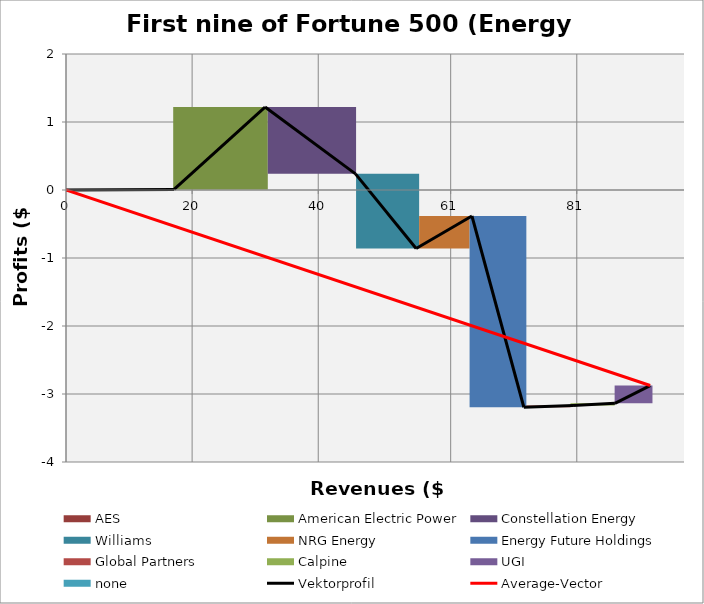
| Category | transparent | AES | American Electric Power | Constellation Energy | Williams | NRG Energy | Energy Future Holdings | Global Partners | Calpine | UGI | none | Border right & top |
|---|---|---|---|---|---|---|---|---|---|---|---|---|
| 0.0 | 0 | 0.009 | 0 | 0 | 0 | 0 | 0 | 0 | 0 | 0 | 0 | 0 |
| 17.138 | 0 | 0.009 | 0 | 0 | 0 | 0 | 0 | 0 | 0 | 0 | 0 | 0 |
| 17.138 | 0.009 | 0 | 1.211 | 0 | 0 | 0 | 0 | 0 | 0 | 0 | 0 | 0 |
| 31.565 | 0.009 | 0 | 1.211 | 0 | 0 | 0 | 0 | 0 | 0 | 0 | 0 | 0 |
| 31.565 | 1.22 | 0 | 0 | -0.983 | 0 | 0 | 0 | 0 | 0 | 0 | 0 | 0 |
| 45.905 | 1.22 | 0 | 0 | -0.983 | 0 | 0 | 0 | 0 | 0 | 0 | 0 | 0 |
| 45.905 | 0.237 | 0 | 0 | 0 | -1.097 | 0 | 0 | 0 | 0 | 0 | 0 | 0 |
| 55.521 | 0.237 | 0 | 0 | 0 | -1.097 | 0 | 0 | 0 | 0 | 0 | 0 | 0 |
| 55.521 | -0.86 | 0 | 0 | 0 | 0 | 0.477 | 0 | 0 | 0 | 0 | 0 | 0 |
| 64.37 | -0.86 | 0 | 0 | 0 | 0 | 0.477 | 0 | 0 | 0 | 0 | 0 | 0 |
| 64.37 | -0.383 | 0 | 0 | 0 | 0 | 0 | -2.812 | 0 | 0 | 0 | 0 | 0 |
| 72.605 | -0.383 | 0 | 0 | 0 | 0 | 0 | -2.812 | 0 | 0 | 0 | 0 | 0 |
| 72.605 | -3.195 | 0 | 0 | 0 | 0 | 0 | 0 | 0.027 | 0 | 0 | 0 | 0 |
| 80.4066 | -3.195 | 0 | 0 | 0 | 0 | 0 | 0 | 0.027 | 0 | 0 | 0 | 0 |
| 80.4066 | -3.168 | 0 | 0 | 0 | 0 | 0 | 0 | 0 | 0.031 | 0 | 0 | 0 |
| 87.0436 | -3.168 | 0 | 0 | 0 | 0 | 0 | 0 | 0 | 0.031 | 0 | 0 | 0 |
| 87.0436 | -3.137 | 0 | 0 | 0 | 0 | 0 | 0 | 0 | 0 | 0.261 | 0 | 0 |
| 92.63499999999999 | -3.137 | 0 | 0 | 0 | 0 | 0 | 0 | 0 | 0 | 0.261 | 0 | 0 |
| 92.63499999999999 | -2.876 | 0 | 0 | 0 | 0 | 0 | 0 | 0 | 0 | 0 | 0 | 0 |
| 92.63499999999999 | -2.876 | 0 | 0 | 0 | 0 | 0 | 0 | 0 | 0 | 0 | 0 | 0 |
| 92.63499999999999 | -2.876 | 0 | 0 | 0 | 0 | 0 | 0 | 0 | 0 | 0 | 0 | 0 |
| 97.63499999999999 | -2.876 | 0 | 0 | 0 | 0 | 0 | 0 | 0 | 0 | 0 | 0 | 0 |
| 97.63499999999999 | -2.876 | 0 | 0 | 0 | 0 | 0 | 0 | 0 | 0 | 0 | 0 | 0 |